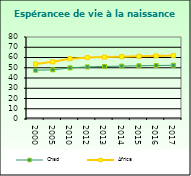
| Category | Chad | Africa                        |
|---|---|---|
| 2000.0 | 47.602 | 53.721 |
| 2005.0 | 48.001 | 55.757 |
| 2010.0 | 49.89 | 58.857 |
| 2012.0 | 50.808 | 59.91 |
| 2013.0 | 51.217 | 60.376 |
| 2014.0 | 51.581 | 60.801 |
| 2015.0 | 51.897 | 61.187 |
| 2016.0 | 52.177 | 61.538 |
| 2017.0 | 52.438 | 61.865 |